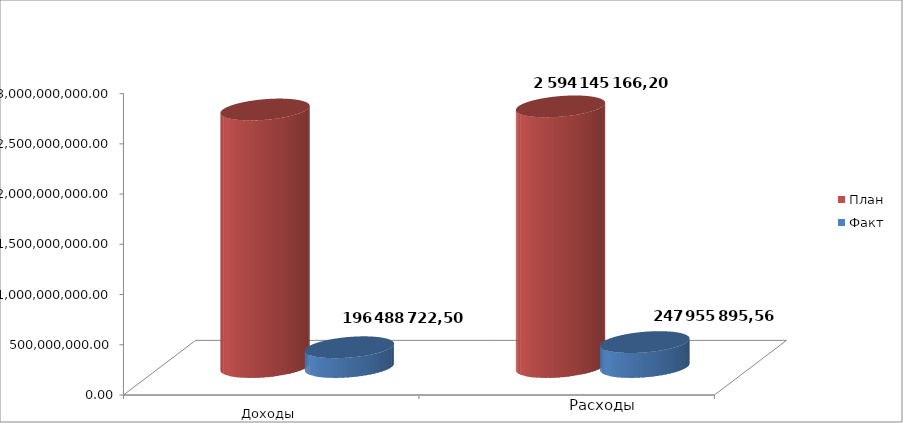
| Category | План | Факт |
|---|---|---|
| 0 | 2563064654 | 196488722.5 |
| 1 | 2594145166.2 | 247955895.56 |